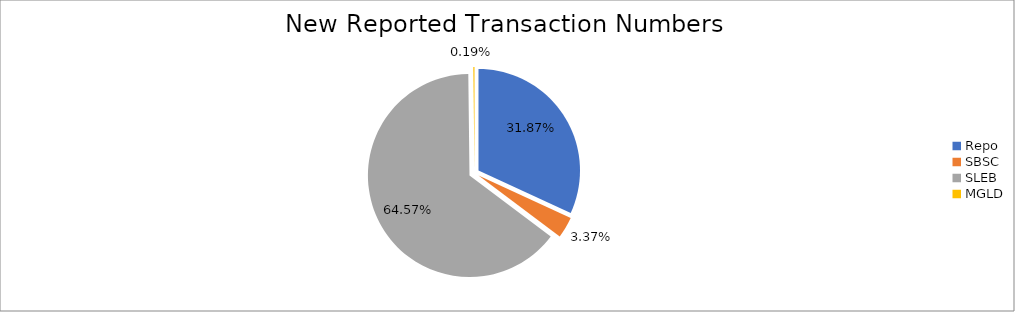
| Category | Series 0 |
|---|---|
| Repo | 420790 |
| SBSC | 44520 |
| SLEB | 852720 |
| MGLD | 2495 |